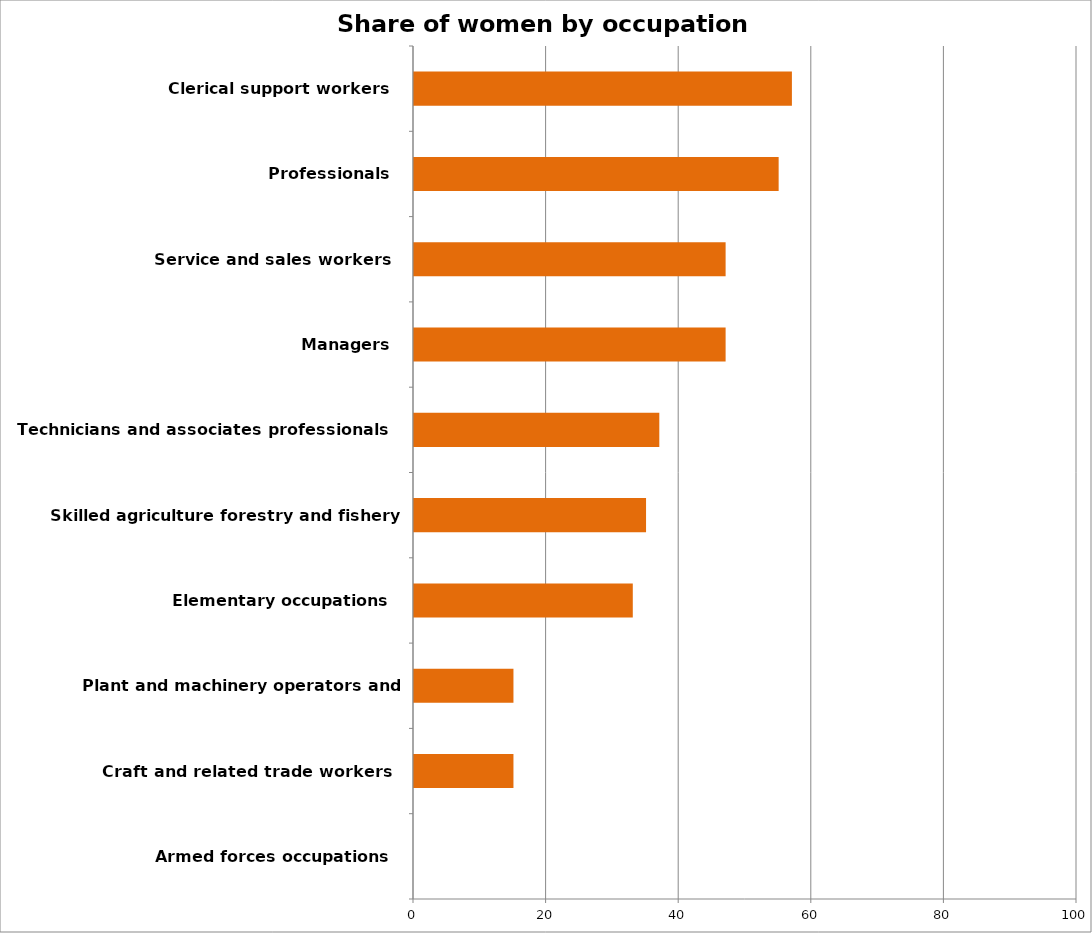
| Category | % W |
|---|---|
| Armed forces occupations  | 0 |
| Craft and related trade workers  | 15 |
| Plant and machinery operators and assemblers  | 15 |
| Elementary occupations  | 33 |
| Skilled agriculture forestry and fishery workers  | 35 |
| Technicians and associates professionals  | 37 |
| Managers  | 47 |
| Service and sales workers  | 47 |
| Professionals  | 55 |
| Clerical support workers  | 57 |